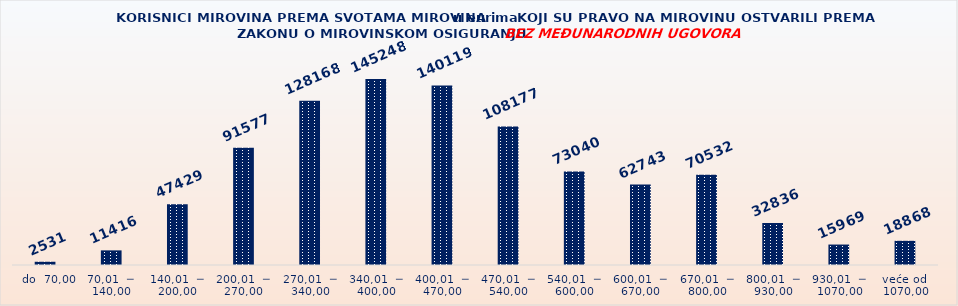
| Category | KORISNICI MIROVINA PREMA VRSTAMA I SVOTAMA MIROVINA KOJI SU PRAVO NA MIROVINU OSTVARILI PREMA ZAKONU O MIROVINSKOM OSIGURANJU 
BEZ MEĐUNARODNIH UGOVORA |
|---|---|
|   do  70,00 | 2531 |
| 70,01  ─  140,00 | 11416 |
| 140,01  ─  200,00 | 47429 |
| 200,01  ─  270,00 | 91577 |
| 270,01  ─  340,00 | 128168 |
| 340,01  ─  400,00 | 145248 |
| 400,01  ─  470,00 | 140119 |
| 470,01  ─  540,00 | 108177 |
| 540,01  ─  600,00 | 73040 |
| 600,01  ─  670,00 | 62743 |
| 670,01  ─  800,00 | 70532 |
| 800,01  ─  930,00 | 32836 |
| 930,01  ─  1070,00 | 15969 |
| veće od  1070,00 | 18868 |